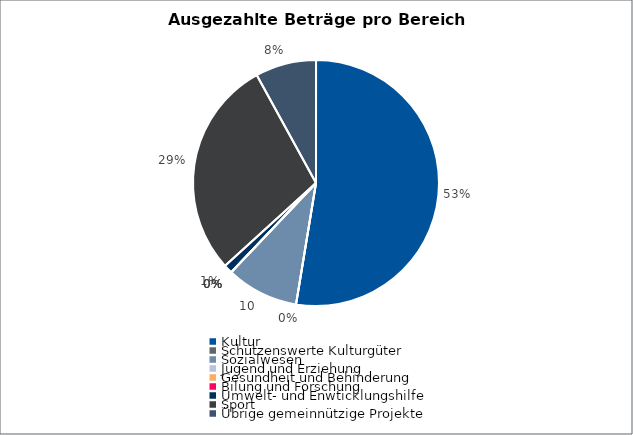
| Category | Series 0 |
|---|---|
| Kultur | 11458730.65 |
| Schützenswerte Kulturgüter | 0 |
| Sozialwesen | 2067626 |
| Jugend und Erziehung | 0 |
| Gesundheit und Behinderung | 0 |
| Bilung und Forschung | 0 |
| Umwelt- und Enwticklungshilfe | 250000 |
| Sport | 6266460.4 |
| Übrige gemeinnützige Projekte | 1743805 |